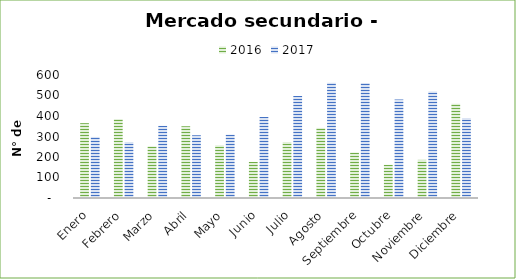
| Category | 2016 | 2017 |
|---|---|---|
| Enero | 365 | 298 |
| Febrero | 385 | 273 |
| Marzo | 252 | 352 |
| Abril | 350 | 306 |
| Mayo | 257 | 309 |
| Junio | 176 | 395 |
| Julio | 273 | 498 |
| Agosto | 342 | 562 |
| Septiembre | 222 | 561 |
| Octubre | 162 | 480 |
| Noviembre | 186 | 519 |
| Diciembre | 460 | 390 |